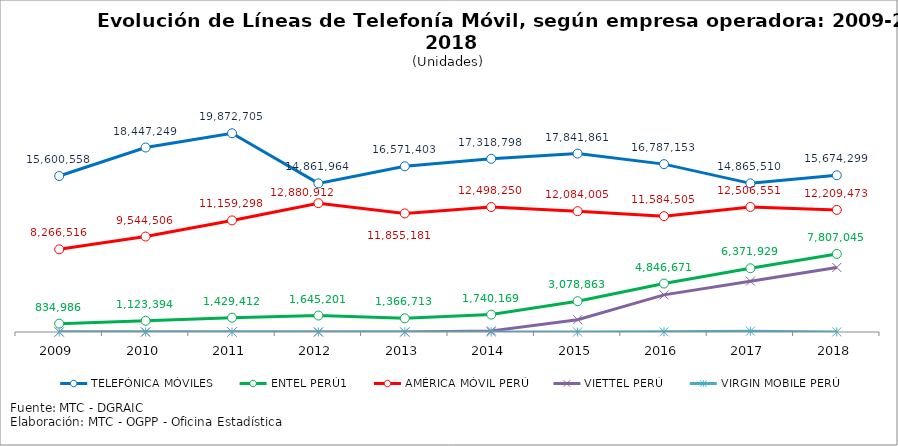
| Category | TELEFÓNICA MÓVILES | ENTEL PERÚ1 | AMÉRICA MÓVIL PERÚ | VIETTEL PERÚ | VIRGIN MOBILE PERÚ |
|---|---|---|---|---|---|
| 2009.0 | 15600558 | 834986 | 8266516 | 0 | 0 |
| 2010.0 | 18447249 | 1123394 | 9544506 | 0 | 0 |
| 2011.0 | 19872705 | 1429412 | 11159298 | 0 | 0 |
| 2012.0 | 14861964 | 1645201 | 12880912 | 0 | 0 |
| 2013.0 | 16571403 | 1366713 | 11855181 | 0 | 0 |
| 2014.0 | 17318798 | 1740169 | 12498250 | 109027 | 0 |
| 2015.0 | 17841861 | 3078863 | 12084005 | 1231081 | 0 |
| 2016.0 | 16787153 | 4846671 | 11584505 | 3714832 | 21779 |
| 2017.0 | 14865510 | 6371929 | 12506551 | 5084880 | 86516 |
| 2018.0 | 15674299 | 7807045 | 12209473 | 6455613 | 8341 |